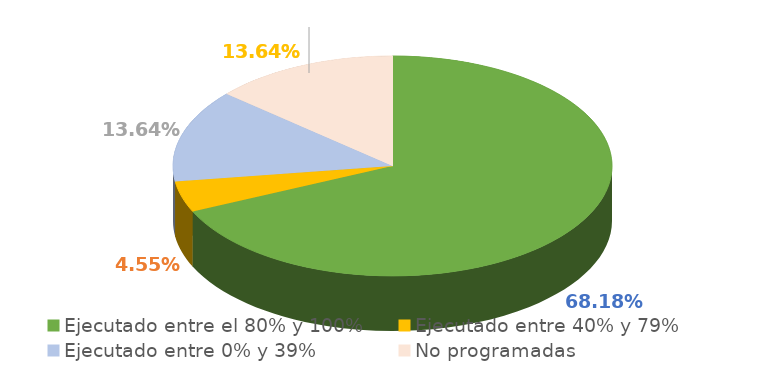
| Category | Series 0 |
|---|---|
| Ejecutado entre el 80% y 100% | 0.682 |
| Ejecutado entre 40% y 79% | 0.045 |
| Ejecutado entre 0% y 39% | 0.136 |
| No programadas | 0.136 |